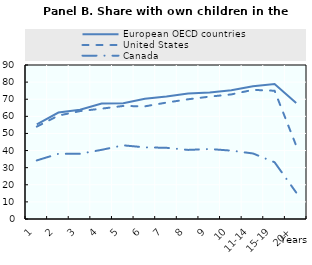
| Category | European OECD countries | United States | Canada |
|---|---|---|---|
| 1 | 55.291 | 53.98 | 34.238 |
| 2 | 62.202 | 60.446 | 38.112 |
| 3 | 63.877 | 63.056 | 38.117 |
| 4 | 67.513 | 64.493 | 40.426 |
| 5 | 67.596 | 66.062 | 43.053 |
| 6 | 70.297 | 65.835 | 41.87 |
| 7 | 71.552 | 68.039 | 41.611 |
| 8 | 73.364 | 69.972 | 40.378 |
| 9 | 73.924 | 71.521 | 40.896 |
| 10 | 75.263 | 72.814 | 39.951 |
| 11-14 | 77.625 | 75.466 | 38.302 |
| 15-19 | 78.928 | 74.957 | 33.17 |
| 20+ | 67.76 | 42.862 | 15.473 |